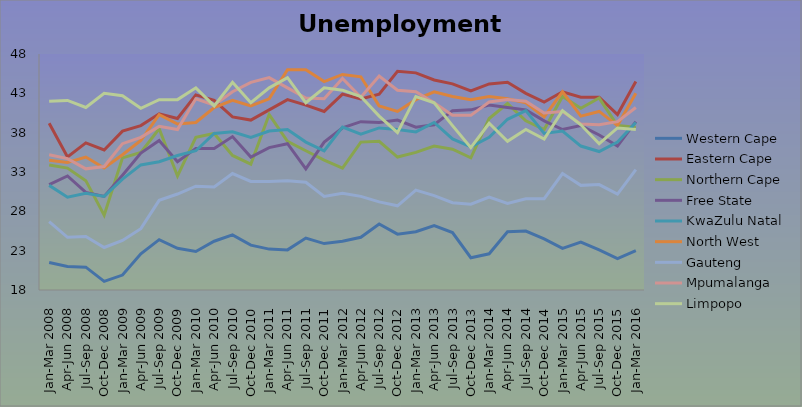
| Category | Western Cape | Eastern Cape | Northern Cape | Free State | KwaZulu Natal | North West | Gauteng | Mpumalanga | Limpopo |
|---|---|---|---|---|---|---|---|---|---|
| Jan-Mar 2008 | 21.5 | 39.2 | 33.9 | 31.4 | 31.3 | 34.5 | 26.7 | 35.2 | 42 |
| Apr-Jun 2008 | 21 | 34.9 | 33.5 | 32.5 | 29.8 | 34.2 | 24.7 | 34.7 | 42.1 |
| Jul-Sep 2008 | 20.9 | 36.7 | 31.9 | 30.4 | 30.3 | 34.9 | 24.8 | 33.4 | 41.2 |
| Oct-Dec 2008 | 19.1 | 35.8 | 27.5 | 29.9 | 29.9 | 33.5 | 23.4 | 33.7 | 43 |
| Jan-Mar 2009 | 19.9 | 38.2 | 34.8 | 32.6 | 32.1 | 35.2 | 24.3 | 36.6 | 42.7 |
| Apr-Jun 2009 | 22.6 | 38.9 | 35.5 | 35.4 | 33.9 | 37 | 25.8 | 37.4 | 41.1 |
| Jul-Sep 2009 | 24.4 | 40.4 | 38.5 | 37 | 34.3 | 40.3 | 29.4 | 38.8 | 42.2 |
| Oct-Dec 2009 | 23.3 | 39.8 | 32.5 | 34.3 | 35.1 | 39.1 | 30.2 | 38.4 | 42.2 |
| Jan-Mar 2010 | 22.9 | 42.8 | 37.4 | 36 | 35.7 | 39.3 | 31.2 | 42.3 | 43.7 |
| Apr-Jun 2010 | 24.2 | 42.1 | 37.9 | 36 | 37.9 | 41.2 | 31.1 | 41.5 | 41.4 |
| Jul-Sep 2010 | 25 | 40 | 35.1 | 37.5 | 38.1 | 42.1 | 32.8 | 43.2 | 44.4 |
| Oct-Dec 2010 | 23.7 | 39.6 | 34 | 34.9 | 37.4 | 41.4 | 31.8 | 44.4 | 41.8 |
| Jan-Mar 2011 | 23.2 | 40.9 | 40.3 | 36.1 | 38.2 | 42.3 | 31.8 | 45 | 43.7 |
| Apr-Jun 2011 | 23.1 | 42.2 | 36.9 | 36.6 | 38.4 | 46 | 31.9 | 43.7 | 45 |
| Jul-Sep 2011 | 24.6 | 41.5 | 35.7 | 33.4 | 36.8 | 46 | 31.7 | 42.4 | 41.8 |
| Oct-Dec 2011 | 23.9 | 40.7 | 34.5 | 36.8 | 35.7 | 44.5 | 29.9 | 42.3 | 43.7 |
| Jan-Mar 2012 | 24.2 | 42.9 | 33.5 | 38.6 | 38.7 | 45.4 | 30.3 | 44.9 | 43.4 |
| Apr-Jun 2012 | 24.7 | 42.3 | 36.8 | 39.4 | 37.8 | 45.1 | 29.9 | 42.5 | 42.6 |
| Jul-Sep 2012 | 26.4 | 42.9 | 36.9 | 39.3 | 38.6 | 41.4 | 29.2 | 45.2 | 40.1 |
| Oct-Dec 2012 | 25.1 | 45.8 | 34.9 | 39.6 | 38.4 | 40.7 | 28.7 | 43.4 | 38 |
| Jan-Mar 2013 | 25.4 | 45.6 | 35.5 | 38.7 | 38.1 | 42.2 | 30.7 | 43.2 | 42.6 |
| Apr-Jun 2013 | 26.2 | 44.7 | 36.3 | 39 | 39.3 | 43.2 | 30 | 41.8 | 41.8 |
| Jul-Sep 2013 | 25.3 | 44.2 | 35.9 | 40.8 | 37.2 | 42.6 | 29.1 | 40.2 | 38.9 |
| Oct-Dec 2013 | 22.1 | 43.3 | 34.8 | 40.9 | 36.2 | 42.2 | 28.9 | 40.2 | 36.1 |
| Jan-Mar 2014 | 22.6 | 44.2 | 39.8 | 41.5 | 37.4 | 42.6 | 29.8 | 41.9 | 39.2 |
| Apr-Jun 2014 | 25.4 | 44.4 | 41.7 | 41.2 | 39.7 | 42.3 | 29 | 42.2 | 36.9 |
| Jul-Sep 2014 | 25.5 | 43 | 39.5 | 40.9 | 40.8 | 41.8 | 29.6 | 42 | 38.4 |
| Oct-Dec 2014 | 24.5 | 41.9 | 38.4 | 39.5 | 37.9 | 40 | 29.6 | 40.5 | 37.2 |
| Jan-Mar 2015 | 23.3 | 43.2 | 42.6 | 38.4 | 38.2 | 43.2 | 32.8 | 40.7 | 40.8 |
| Apr-Jun 2015 | 24.1 | 42.5 | 41.1 | 38.9 | 36.3 | 40.1 | 31.3 | 39.1 | 39 |
| Jul-Sep 2015 | 23.1 | 42.5 | 42.4 | 37.7 | 35.6 | 40.7 | 31.4 | 39 | 36.6 |
| Oct-Dec 2015 | 22 | 40.3 | 38.9 | 36.3 | 36.8 | 38.9 | 30.2 | 39.4 | 38.6 |
| Jan-Mar 2016 | 23 | 44.5 | 38.7 | 39.4 | 39.3 | 43 | 33.3 | 41.2 | 38.4 |